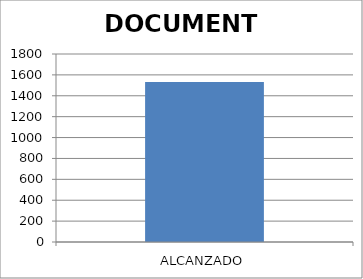
| Category | DOCUMENTO |
|---|---|
| ALCANZADO | 1532 |